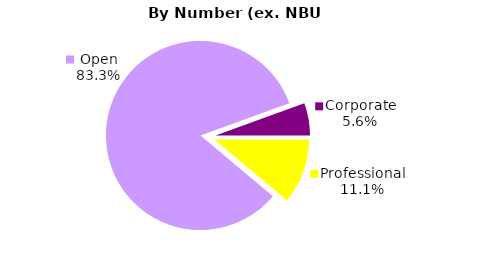
| Category | Series 0 |
|---|---|
| Open | 45 |
| Corporate | 3 |
| Professional | 6 |